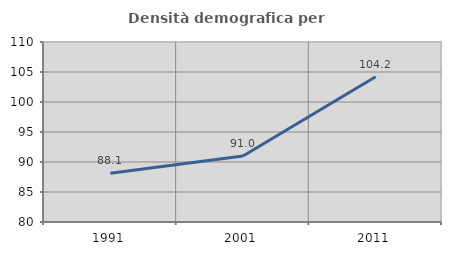
| Category | Densità demografica |
|---|---|
| 1991.0 | 88.139 |
| 2001.0 | 91.004 |
| 2011.0 | 104.219 |